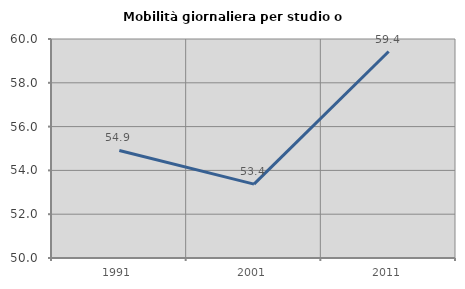
| Category | Mobilità giornaliera per studio o lavoro |
|---|---|
| 1991.0 | 54.912 |
| 2001.0 | 53.372 |
| 2011.0 | 59.429 |